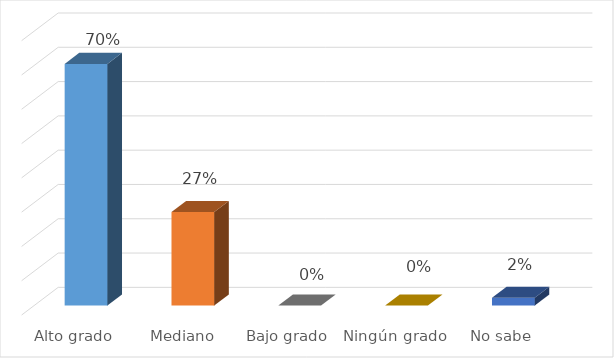
| Category | Series 0 |
|---|---|
| Alto grado | 0.705 |
| Mediano grado | 0.273 |
| Bajo grado | 0 |
| Ningún grado | 0 |
| No sabe | 0.023 |